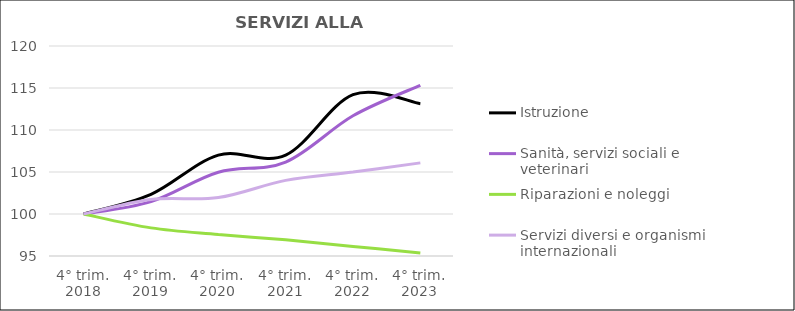
| Category | Istruzione | Sanità, servizi sociali e veterinari  | Riparazioni e noleggi  | Servizi diversi e organismi internazionali |
|---|---|---|---|---|
| 4° trim.
2018 | 100 | 100 | 100 | 100 |
| 4° trim.
2019 | 102.338 | 101.478 | 98.347 | 101.73 |
| 4° trim.
2020 | 107.014 | 104.973 | 97.567 | 101.954 |
| 4° trim.
2021 | 107.014 | 106.183 | 96.924 | 104.004 |
| 4° trim.
2022 | 114.209 | 111.694 | 96.143 | 104.997 |
| 4° trim.
2023 | 113.129 | 115.323 | 95.363 | 106.086 |